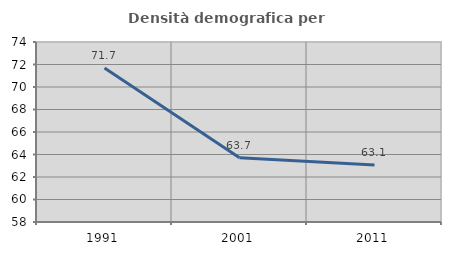
| Category | Densità demografica |
|---|---|
| 1991.0 | 71.687 |
| 2001.0 | 63.722 |
| 2011.0 | 63.073 |